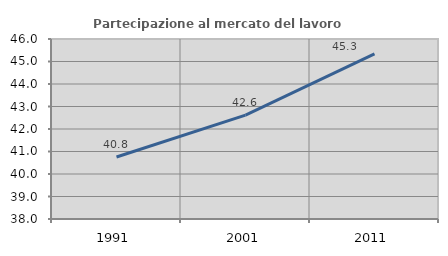
| Category | Partecipazione al mercato del lavoro  femminile |
|---|---|
| 1991.0 | 40.755 |
| 2001.0 | 42.62 |
| 2011.0 | 45.338 |